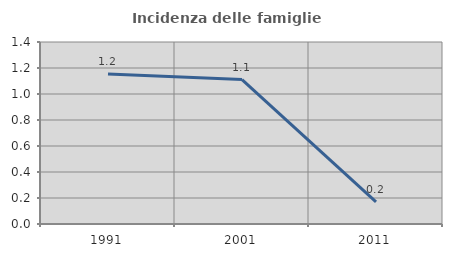
| Category | Incidenza delle famiglie numerose |
|---|---|
| 1991.0 | 1.154 |
| 2001.0 | 1.111 |
| 2011.0 | 0.169 |